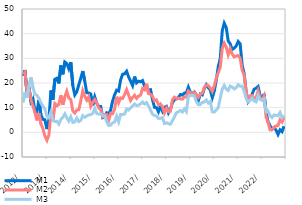
| Category | M1 | M2 | M3 |
|---|---|---|---|
| 2012-01-01 | 22.894 | 23.623 | 12.01 |
| 2012-02-01 | 25.141 | 24.458 | 16.354 |
| 2012-03-01 | 15.804 | 16.278 | 13.992 |
| 2012-04-01 | 18.252 | 18.032 | 18.952 |
| 2012-05-01 | 12.344 | 13.23 | 22.329 |
| 2012-06-01 | 13.574 | 10.607 | 18.134 |
| 2012-07-01 | 8.526 | 8.045 | 15.507 |
| 2012-08-01 | 8.225 | 4.815 | 15.015 |
| 2012-09-01 | 13.172 | 7.741 | 13.837 |
| 2012-10-01 | 6.96 | 3.373 | 11.912 |
| 2012-11-01 | 5.27 | 1.496 | 10.629 |
| 2012-12-01 | 5.109 | -1.475 | 9.421 |
| 2013-01-01 | 1.337 | -3.233 | 6.554 |
| 2013-02-01 | 4.789 | -1.06 | 5.916 |
| 2013-03-01 | 16.958 | 7.601 | 8.196 |
| 2013-04-01 | 13.162 | 4.83 | 4.809 |
| 2013-05-01 | 21.538 | 11.61 | 4.39 |
| 2013-06-01 | 21.919 | 10.771 | 4.482 |
| 2013-07-01 | 19.839 | 11.316 | 3.358 |
| 2013-08-01 | 27.102 | 14.976 | 5.277 |
| 2013-09-01 | 23.538 | 11.134 | 6.108 |
| 2013-10-01 | 28.511 | 14.404 | 7.502 |
| 2013-11-01 | 27.856 | 16.667 | 5.896 |
| 2013-12-01 | 25.775 | 13.906 | 4.573 |
| 2014-01-01 | 28.419 | 13.279 | 6.313 |
| 2014-02-01 | 18.951 | 8.684 | 4.038 |
| 2014-03-01 | 15.171 | 7.841 | 4.234 |
| 2014-04-01 | 16.413 | 9.062 | 5.797 |
| 2014-05-01 | 19.283 | 9.163 | 4.358 |
| 2014-06-01 | 21.92 | 12.745 | 4.845 |
| 2014-07-01 | 24.838 | 16.834 | 6.767 |
| 2014-08-01 | 20.711 | 14.613 | 6.108 |
| 2014-09-01 | 16.052 | 13.024 | 6.605 |
| 2014-10-01 | 15.971 | 14.42 | 7.075 |
| 2014-11-01 | 15.55 | 10.536 | 7.143 |
| 2014-12-01 | 10.973 | 12.112 | 7.648 |
| 2015-01-01 | 14.347 | 13.315 | 9.694 |
| 2015-02-01 | 11.784 | 12.027 | 7.639 |
| 2015-03-01 | 10.473 | 9.88 | 7.404 |
| 2015-04-01 | 10.477 | 9.219 | 7.508 |
| 2015-05-01 | 5.957 | 6.379 | 6.749 |
| 2015-06-01 | 6.277 | 7.137 | 6.629 |
| 2015-07-01 | 7.901 | 7.2 | 4.381 |
| 2015-08-01 | 7.374 | 4.74 | 2.769 |
| 2015-09-01 | 9.062 | 7.676 | 2.936 |
| 2015-10-01 | 12.775 | 7.543 | 3.902 |
| 2015-11-01 | 15.218 | 9.44 | 4.175 |
| 2015-12-01 | 17.083 | 14.431 | 6.564 |
| 2016-01-01 | 16.738 | 11.99 | 4.278 |
| 2016-02-01 | 21.261 | 13.949 | 7.267 |
| 2016-03-01 | 23.541 | 13.75 | 7.218 |
| 2016-04-01 | 23.712 | 15.298 | 7.458 |
| 2016-05-01 | 24.76 | 17.335 | 9.45 |
| 2016-06-01 | 22.478 | 15.149 | 9.03 |
| 2016-07-01 | 20.781 | 12.905 | 9.881 |
| 2016-08-01 | 18.976 | 14.151 | 10.715 |
| 2016-09-01 | 22.608 | 15.014 | 11.496 |
| 2016-10-01 | 20.037 | 13.76 | 10.853 |
| 2016-11-01 | 20.731 | 14.738 | 11.002 |
| 2016-12-01 | 20.493 | 15.066 | 11.553 |
| 2017-01-01 | 20.985 | 17.752 | 12.319 |
| 2017-02-01 | 18.755 | 17.238 | 11.489 |
| 2017-03-01 | 18.164 | 19.723 | 12.067 |
| 2017-04-01 | 17.137 | 15.675 | 10.696 |
| 2017-05-01 | 17.304 | 15.426 | 9.013 |
| 2017-06-01 | 13.291 | 14.629 | 7.423 |
| 2017-07-01 | 10.155 | 12.774 | 6.807 |
| 2017-08-01 | 10.008 | 13.153 | 6.642 |
| 2017-09-01 | 8.33 | 11.173 | 5.632 |
| 2017-10-01 | 10.656 | 11.444 | 5.691 |
| 2017-11-01 | 8.565 | 10.442 | 5.952 |
| 2017-12-01 | 10.17 | 7.88 | 3.567 |
| 2018-01-01 | 10.538 | 9.858 | 3.888 |
| 2018-02-01 | 7.896 | 8.367 | 3.511 |
| 2018-03-01 | 9.37 | 8.532 | 3.318 |
| 2018-04-01 | 11.942 | 13.205 | 4.689 |
| 2018-05-01 | 13.349 | 14.252 | 6.249 |
| 2018-06-01 | 13.538 | 13.74 | 7.929 |
| 2018-07-01 | 14.172 | 13.884 | 8.383 |
| 2018-08-01 | 15.344 | 13.517 | 8.861 |
| 2018-09-01 | 15.094 | 13.468 | 8.24 |
| 2018-10-31 | 15.922 | 14.378 | 9.483 |
| 2018-11-30 | 15.931 | 14.253 | 8.409 |
| 2018-12-31 | 18.316 | 16.722 | 14.522 |
| 2019-01-31 | 16.166 | 16.02 | 14.909 |
| 2019-02-28 | 15.742 | 15.287 | 15.018 |
| 2019-03-31 | 16.361 | 16.241 | 14.797 |
| 2019-04-30 | 15.105 | 15.41 | 12.506 |
| 2019-05-31 | 12.819 | 14.179 | 11.216 |
| 2019-06-30 | 15.525 | 15.44 | 11.23 |
| 2019-07-31 | 15.186 | 15.908 | 12.186 |
| 2019-08-31 | 17.797 | 18.193 | 12.279 |
| 2019-09-30 | 19.338 | 19.165 | 13.127 |
| 2019-10-31 | 18.111 | 18.951 | 11.864 |
| 2019-11-30 | 17.168 | 17.97 | 12.513 |
| 2019-12-31 | 14.043 | 16.581 | 8.354 |
| 2020-01-31 | 16.712 | 18.903 | 8.237 |
| 2020-02-29 | 21.093 | 22.007 | 9.035 |
| 2020-03-31 | 26.588 | 24.142 | 10.113 |
| 2020-04-30 | 29.94 | 26.318 | 13.811 |
| 2020-05-31 | 41.15 | 33.976 | 17.557 |
| 2020-06-30 | 44.259 | 36.145 | 18.995 |
| 2020-07-31 | 42.524 | 34.579 | 17.552 |
| 2020-08-31 | 37.03 | 31.452 | 16.965 |
| 2020-09-30 | 35.87 | 33.879 | 18.779 |
| 2020-10-31 | 33.602 | 31.759 | 18.356 |
| 2020-11-30 | 34.115 | 30.574 | 17.578 |
| 2020-12-31 | 35.024 | 30.946 | 18.105 |
| 2021-01-31 | 36.826 | 31.116 | 19.323 |
| 2021-02-28 | 35.865 | 30.063 | 18.702 |
| 2021-03-31 | 27.237 | 25.15 | 18.724 |
| 2021-04-30 | 23.823 | 23.293 | 16.749 |
| 2021-05-31 | 16.551 | 16.433 | 13.689 |
| 2021-06-30 | 12.378 | 13.116 | 12.386 |
| 2021-07-31 | 13.484 | 14.743 | 12.98 |
| 2021-08-31 | 15.449 | 14.916 | 13.971 |
| 2021-09-30 | 17.489 | 13.565 | 12.717 |
| 2021-10-31 | 17.892 | 14.138 | 12.354 |
| 2021-11-30 | 18.578 | 16.842 | 15.024 |
| 2021-12-31 | 14.836 | 13.786 | 13.293 |
| 2022-01-31 | 13.538 | 13.253 | 13.088 |
| 2022-02-28 | 15.563 | 14.867 | 13.628 |
| 2022-03-31 | 8.054 | 6.198 | 8.323 |
| 2022-04-30 | 4.23 | 3.979 | 8.576 |
| 2022-05-31 | 2.674 | 1.065 | 6.855 |
| 2022-06-30 | 1.233 | 1.215 | 6.013 |
| 2022-07-31 | 1.942 | 1.934 | 7.048 |
| 2022-08-31 | 0.905 | 2.624 | 6.841 |
| 2022-09-30 | -0.882 | 2.727 | 6.755 |
| 2022-10-31 | 1.015 | 5.084 | 8.03 |
| 2022-11-30 | 0.274 | 4.163 | 5.915 |
| 2022-12-31 | 2.47 | 6.139 | 6.863 |